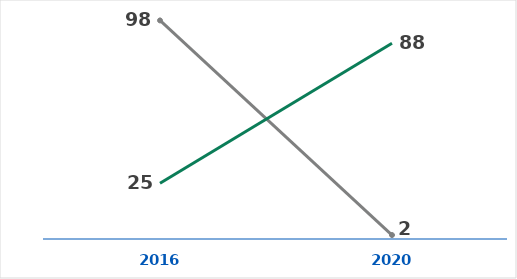
| Category | 3a SSL (PFGE) | 3b SSL (WGS) |
|---|---|---|
| 2016.0 | 98.457 | 25.09 |
| 2020.0 | 1.784 | 88.177 |